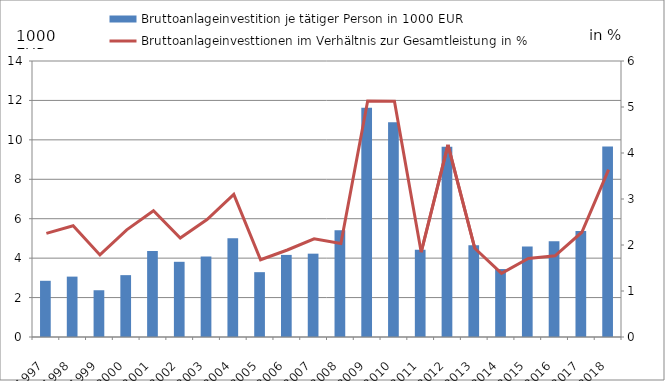
| Category | Bruttoanlageinvestition je tätiger Person in 1000 EUR |
|---|---|
| 1997.0 | 2.851 |
| 1998.0 | 3.063 |
| 1999.0 | 2.372 |
| 2000.0 | 3.138 |
| 2001.0 | 4.367 |
| 2002.0 | 3.814 |
| 2003.0 | 4.083 |
| 2004.0 | 5.015 |
| 2005.0 | 3.288 |
| 2006.0 | 4.165 |
| 2007.0 | 4.227 |
| 2008.0 | 5.419 |
| 2009.0 | 11.626 |
| 2010.0 | 10.891 |
| 2011.0 | 4.427 |
| 2012.0 | 9.648 |
| 2013.0 | 4.651 |
| 2014.0 | 3.447 |
| 2015.0 | 4.586 |
| 2016.0 | 4.852 |
| 2017.0 | 5.378 |
| 2018.0 | 9.666 |